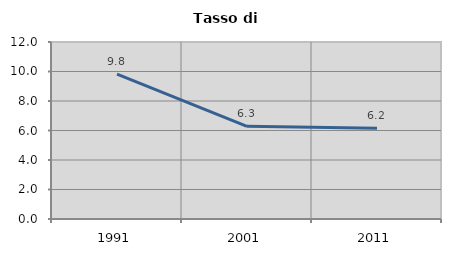
| Category | Tasso di disoccupazione   |
|---|---|
| 1991.0 | 9.825 |
| 2001.0 | 6.283 |
| 2011.0 | 6.157 |